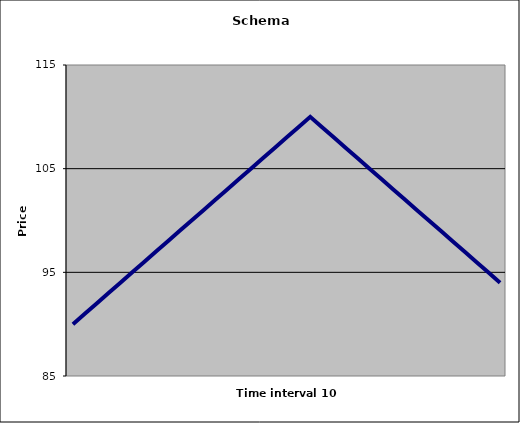
| Category | Bid |
|---|---|
| 0 | 90 |
| 1 | 91 |
| 2 | 92 |
| 3 | 93 |
| 4 | 94 |
| 5 | 95 |
| 6 | 96 |
| 7 | 97 |
| 8 | 98 |
| 9 | 99 |
| 10 | 100 |
| 11 | 101 |
| 12 | 102 |
| 13 | 103 |
| 14 | 104 |
| 15 | 105 |
| 16 | 106 |
| 17 | 107 |
| 18 | 108 |
| 19 | 109 |
| 20 | 110 |
| 21 | 109 |
| 22 | 108 |
| 23 | 107 |
| 24 | 106 |
| 25 | 105 |
| 26 | 104 |
| 27 | 103 |
| 28 | 102 |
| 29 | 101 |
| 30 | 100 |
| 31 | 99 |
| 32 | 98 |
| 33 | 97 |
| 34 | 96 |
| 35 | 95 |
| 36 | 94 |